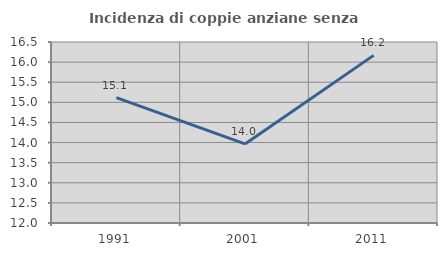
| Category | Incidenza di coppie anziane senza figli  |
|---|---|
| 1991.0 | 15.116 |
| 2001.0 | 13.966 |
| 2011.0 | 16.168 |